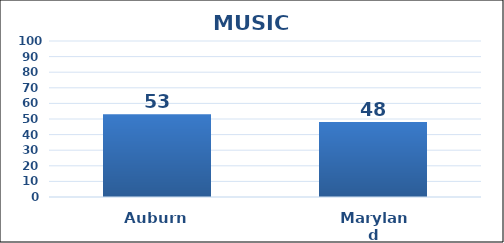
| Category | Series 0 |
|---|---|
| Auburn | 53 |
| Maryland | 48 |